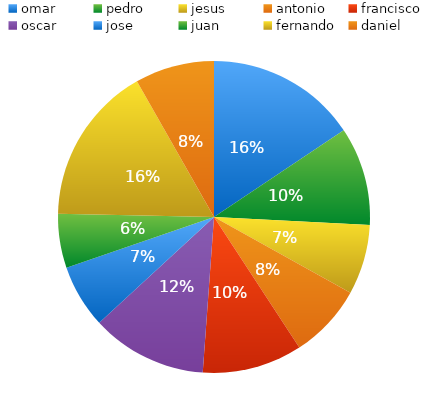
| Category | total |
|---|---|
| omar | 95 |
| pedro | 62 |
| jesus | 44 |
| antonio | 47 |
| francisco | 63 |
| oscar | 73 |
| jose | 40 |
| juan | 34 |
| fernando | 100 |
| daniel | 50 |